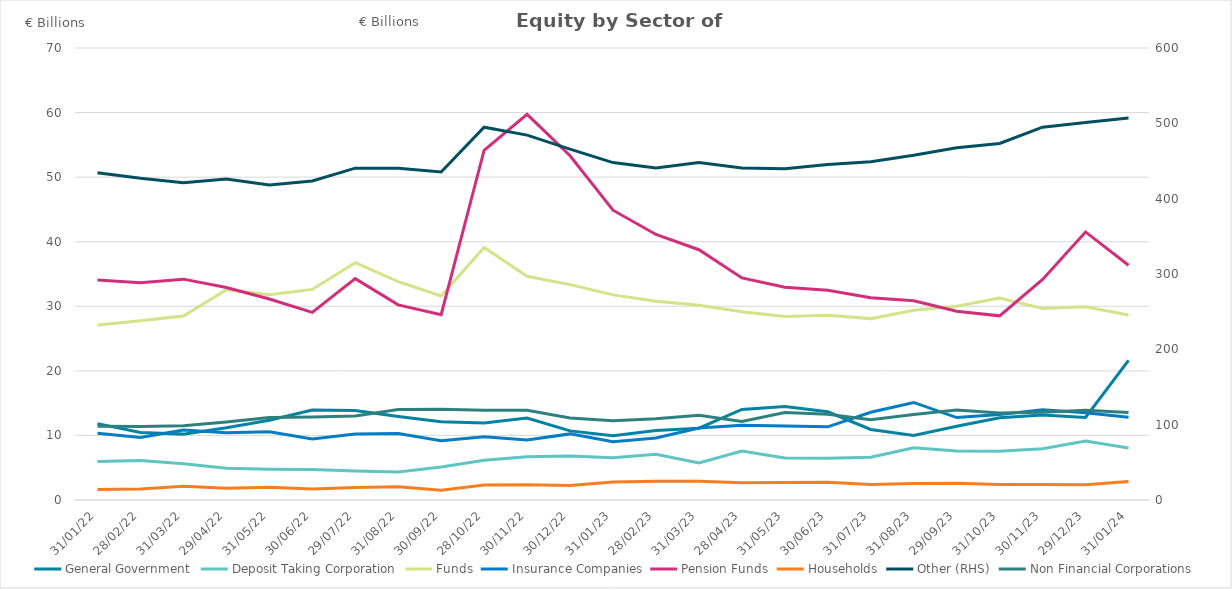
| Category | General Government | Deposit Taking Corporation | Funds | Insurance Companies | Pension Funds | Households |
|---|---|---|---|---|---|---|
| 2022-01-31 | 11.83 | 5.979 | 27.104 | 10.339 | 34.076 | 1.641 |
| 2022-02-28 | 10.462 | 6.126 | 27.762 | 9.668 | 33.63 | 1.717 |
| 2022-03-31 | 10.202 | 5.627 | 28.481 | 10.836 | 34.204 | 2.145 |
| 2022-04-29 | 11.185 | 4.919 | 32.57 | 10.408 | 32.918 | 1.813 |
| 2022-05-31 | 12.338 | 4.769 | 31.799 | 10.557 | 31.137 | 1.987 |
| 2022-06-30 | 13.939 | 4.742 | 32.614 | 9.465 | 29.053 | 1.713 |
| 2022-07-29 | 13.855 | 4.501 | 36.745 | 10.203 | 34.288 | 1.936 |
| 2022-08-31 | 12.915 | 4.338 | 33.822 | 10.296 | 30.219 | 2.051 |
| 2022-09-30 | 12.11 | 5.108 | 31.609 | 9.173 | 28.713 | 1.527 |
| 2022-10-28 | 11.933 | 6.139 | 39.096 | 9.785 | 54.166 | 2.317 |
| 2022-11-30 | 12.703 | 6.699 | 34.643 | 9.296 | 59.725 | 2.355 |
| 2022-12-30 | 10.702 | 6.826 | 33.354 | 10.238 | 53.309 | 2.245 |
| 2023-01-31 | 9.96 | 6.532 | 31.769 | 9.038 | 44.881 | 2.784 |
| 2023-02-28 | 10.751 | 7.083 | 30.764 | 9.604 | 41.117 | 2.905 |
| 2023-03-31 | 11.116 | 5.732 | 30.16 | 11.158 | 38.761 | 2.921 |
| 2023-04-28 | 14.019 | 7.587 | 29.146 | 11.566 | 34.389 | 2.668 |
| 2023-05-31 | 14.493 | 6.498 | 28.416 | 11.451 | 32.958 | 2.706 |
| 2023-06-30 | 13.667 | 6.448 | 28.62 | 11.331 | 32.478 | 2.751 |
| 2023-07-31 | 10.921 | 6.639 | 28.091 | 13.579 | 31.31 | 2.386 |
| 2023-08-31 | 10.007 | 8.09 | 29.391 | 15.107 | 30.857 | 2.541 |
| 2023-09-29 | 11.424 | 7.586 | 30.014 | 12.768 | 29.241 | 2.605 |
| 2023-10-31 | 12.743 | 7.569 | 31.289 | 13.229 | 28.523 | 2.415 |
| 2023-11-30 | 13.168 | 7.946 | 29.654 | 13.97 | 34.162 | 2.415 |
| 2023-12-29 | 12.786 | 9.134 | 29.925 | 13.528 | 41.516 | 2.345 |
| 2024-01-31 | 21.623 | 8.055 | 28.664 | 12.813 | 36.356 | 2.876 |